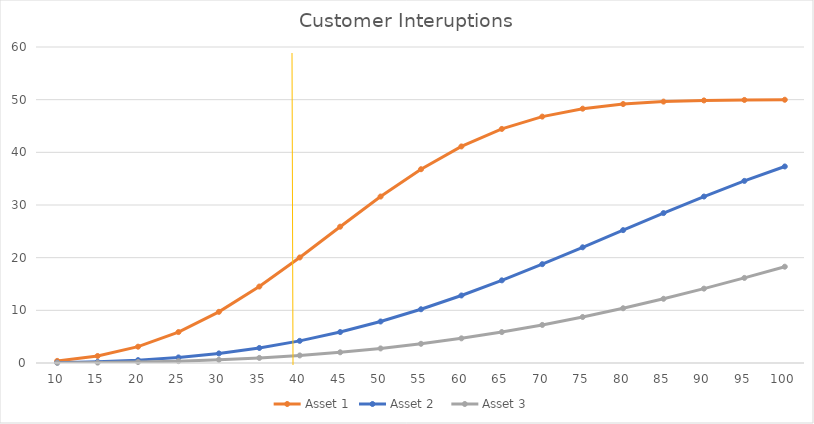
| Category | Asset 1 | Asset 2 | Asset 3 |
|---|---|---|---|
| 10.0 | 0.398 | 0.069 | 0.023 |
| 15.0 | 1.332 | 0.231 | 0.077 |
| 20.0 | 3.1 | 0.546 | 0.182 |
| 25.0 | 5.875 | 1.06 | 0.354 |
| 30.0 | 9.713 | 1.818 | 0.611 |
| 35.0 | 14.518 | 2.856 | 0.966 |
| 40.0 | 20.035 | 4.202 | 1.436 |
| 45.0 | 25.88 | 5.875 | 2.031 |
| 50.0 | 31.606 | 7.879 | 2.765 |
| 55.0 | 36.789 | 10.203 | 3.647 |
| 60.0 | 41.118 | 12.822 | 4.682 |
| 65.0 | 44.443 | 15.694 | 5.875 |
| 70.0 | 46.784 | 18.766 | 7.227 |
| 75.0 | 48.289 | 21.969 | 8.736 |
| 80.0 | 49.168 | 25.229 | 10.394 |
| 85.0 | 49.632 | 28.467 | 12.193 |
| 90.0 | 49.853 | 31.606 | 14.119 |
| 95.0 | 49.948 | 34.576 | 16.156 |
| 100.0 | 49.983 | 37.317 | 18.283 |